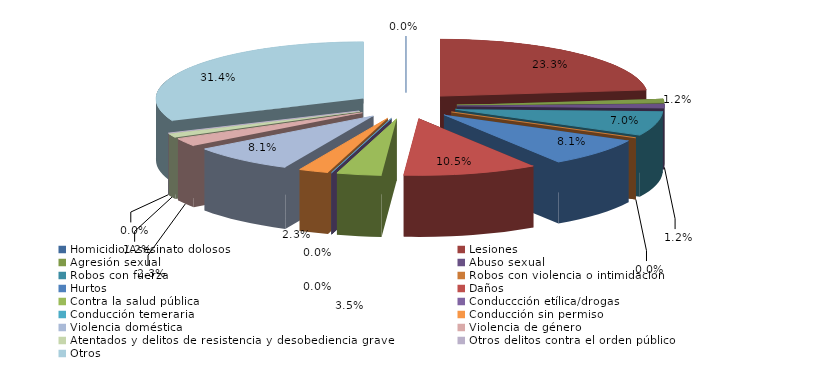
| Category | Series 0 |
|---|---|
| Homicidio/Asesinato dolosos | 0 |
| Lesiones | 20 |
| Agresión sexual | 1 |
| Abuso sexual | 1 |
| Robos con fuerza | 6 |
| Robos con violencia o intimidación | 0 |
| Hurtos | 7 |
| Daños | 9 |
| Contra la salud pública | 3 |
| Conduccción etílica/drogas | 0 |
| Conducción temeraria | 0 |
| Conducción sin permiso | 2 |
| Violencia doméstica | 7 |
| Violencia de género | 2 |
| Atentados y delitos de resistencia y desobediencia grave | 1 |
| Otros delitos contra el orden público | 0 |
| Otros | 27 |